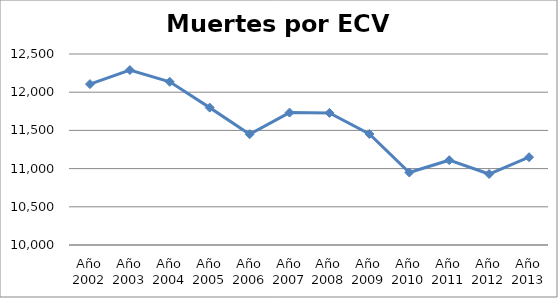
| Category | Series 0 |
|---|---|
| Año 2002 | 12106 |
| Año 2003 | 12289 |
| Año 2004 | 12136 |
| Año 2005 | 11798 |
| Año 2006 | 11450 |
| Año 2007 | 11733 |
| Año 2008 | 11729 |
| Año 2009 | 11453 |
| Año 2010 | 10949 |
| Año 2011 | 11110 |
| Año 2012 | 10929 |
| Año 2013 | 11149 |